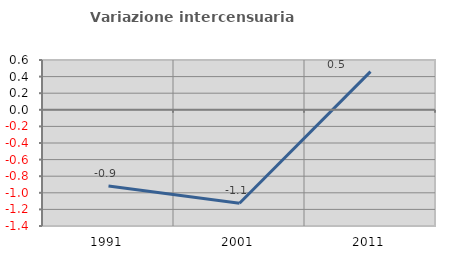
| Category | Variazione intercensuaria annua |
|---|---|
| 1991.0 | -0.919 |
| 2001.0 | -1.126 |
| 2011.0 | 0.459 |